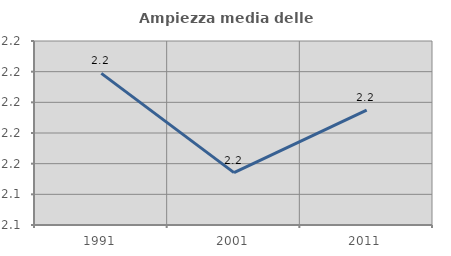
| Category | Ampiezza media delle famiglie |
|---|---|
| 1991.0 | 2.219 |
| 2001.0 | 2.154 |
| 2011.0 | 2.195 |